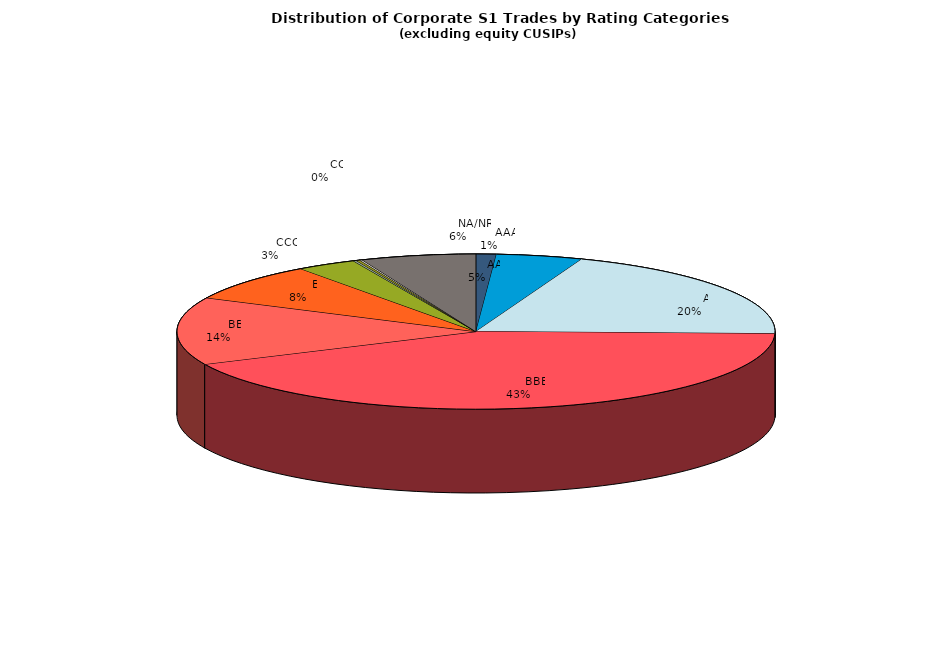
| Category | Series 0 |
|---|---|
|         AAA | 675 |
|         AA | 2886.813 |
|         A | 12148.494 |
|         BBB | 26356.562 |
|         BB | 8695.219 |
|         B | 4857.614 |
|         CCC | 1997.414 |
|         CC | 106.12 |
|         C | 123.235 |
|         D | 88.211 |
|         NA/NR | 3842.299 |